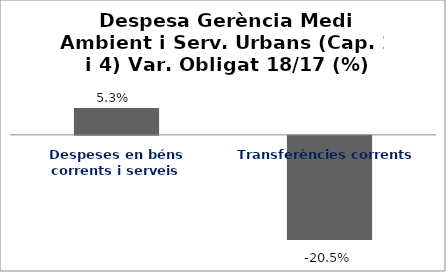
| Category | Series 0 |
|---|---|
| Despeses en béns corrents i serveis | 0.053 |
| Transferències corrents | -0.205 |